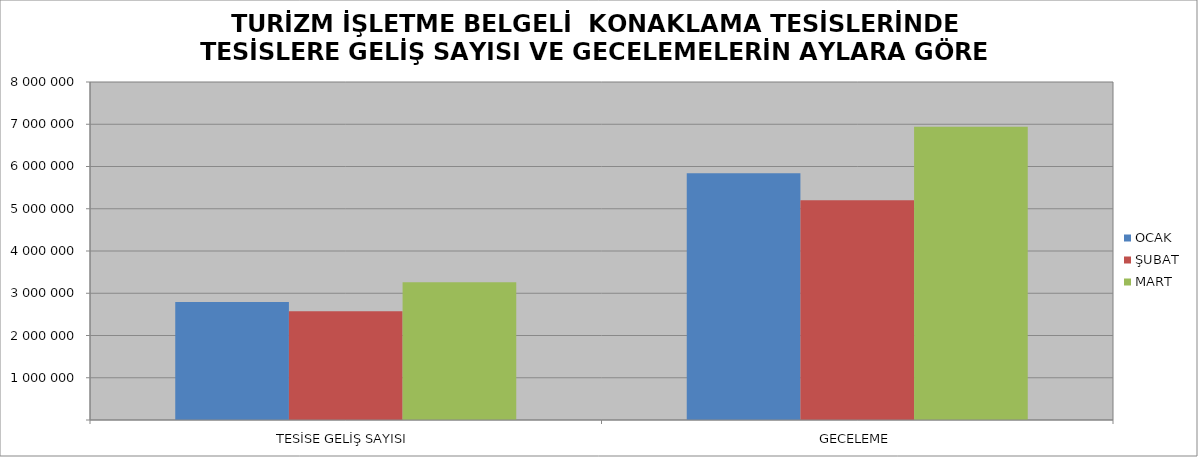
| Category | OCAK | ŞUBAT | MART |
|---|---|---|---|
| TESİSE GELİŞ SAYISI | 2792196 | 2573999 | 3258929 |
| GECELEME | 5837753 | 5199578 | 6939659 |